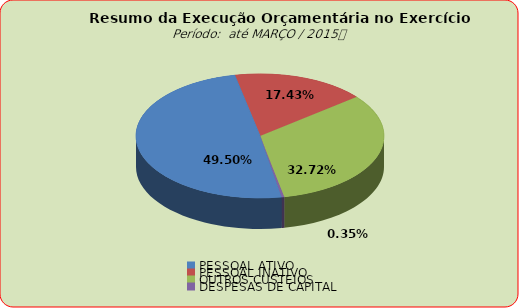
| Category | Series 0 |
|---|---|
| PESSOAL ATIVO | 30964466.68 |
| PESSOAL INATIVO | 10901135.91 |
| OUTROS CUSTEIOS | 20467675 |
| DESPESAS DE CAPITAL | 217432.7 |